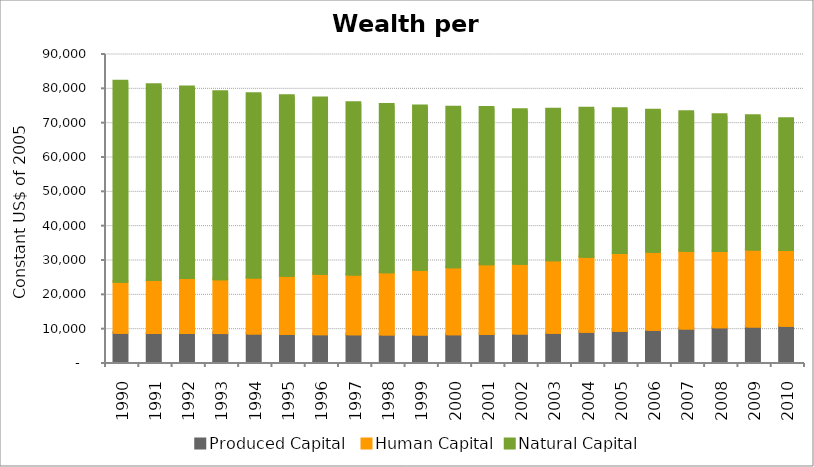
| Category | Produced Capital  | Human Capital | Natural Capital |
|---|---|---|---|
| 1990.0 | 8496.354 | 14907.536 | 58358.795 |
| 1991.0 | 8452.323 | 15438.544 | 56895.176 |
| 1992.0 | 8466.791 | 15968.812 | 55667.081 |
| 1993.0 | 8425.325 | 15711.548 | 54577.076 |
| 1994.0 | 8309.762 | 16324.309 | 53506.403 |
| 1995.0 | 8170.99 | 16959.201 | 52393.205 |
| 1996.0 | 8101.201 | 17573.388 | 51219.76 |
| 1997.0 | 8068.623 | 17427.186 | 49998.038 |
| 1998.0 | 8042.047 | 18119.854 | 48826.41 |
| 1999.0 | 8040.372 | 18826.321 | 47675.074 |
| 2000.0 | 8061.563 | 19549.816 | 46618.656 |
| 2001.0 | 8152.767 | 20317.022 | 45692.611 |
| 2002.0 | 8313.666 | 20285.201 | 44836.079 |
| 2003.0 | 8537.965 | 21083.546 | 44013.572 |
| 2004.0 | 8805.516 | 21867.597 | 43205.267 |
| 2005.0 | 9111.712 | 22607.327 | 42041.052 |
| 2006.0 | 9415.056 | 22667.028 | 41246.841 |
| 2007.0 | 9744.685 | 22662.718 | 40473.901 |
| 2008.0 | 10105.853 | 22190.667 | 39709.086 |
| 2009.0 | 10345.407 | 22396.078 | 38951.578 |
| 2010.0 | 10571.817 | 22077.327 | 38210.52 |